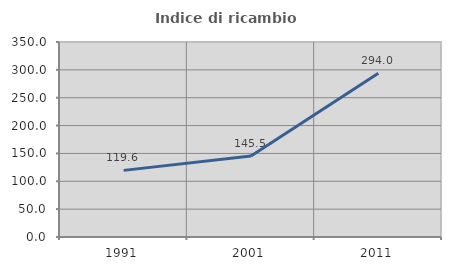
| Category | Indice di ricambio occupazionale  |
|---|---|
| 1991.0 | 119.569 |
| 2001.0 | 145.532 |
| 2011.0 | 294.014 |